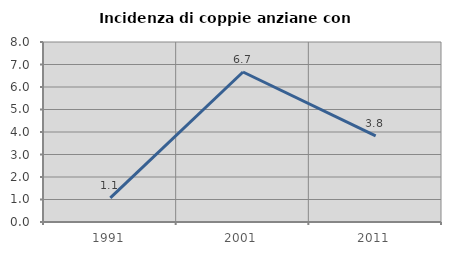
| Category | Incidenza di coppie anziane con figli |
|---|---|
| 1991.0 | 1.07 |
| 2001.0 | 6.667 |
| 2011.0 | 3.828 |